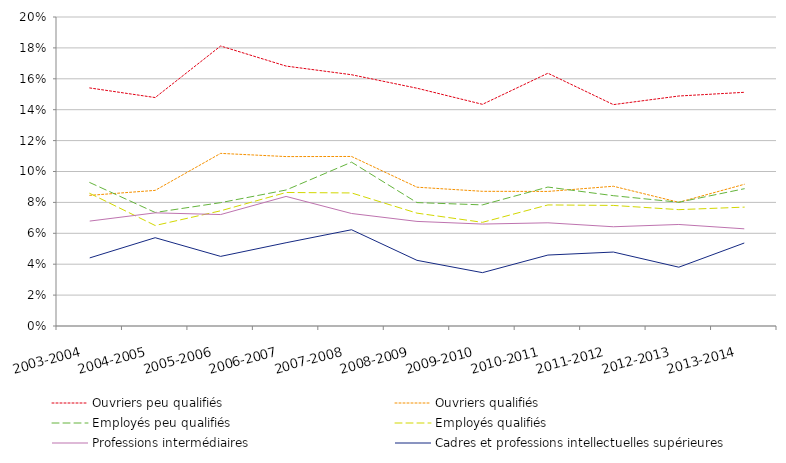
| Category | Ouvriers peu qualifiés | Ouvriers qualifiés | Employés peu qualifiés | Employés qualifiés | Professions intermédiaires | Cadres et professions intellectuelles supérieures |
|---|---|---|---|---|---|---|
| 2003-2004 | 0.154 | 0.085 | 0.093 | 0.086 | 0.068 | 0.044 |
| 2004-2005 | 0.148 | 0.088 | 0.073 | 0.065 | 0.073 | 0.057 |
| 2005-2006 | 0.181 | 0.112 | 0.08 | 0.075 | 0.072 | 0.045 |
| 2006-2007 | 0.168 | 0.11 | 0.088 | 0.086 | 0.084 | 0.054 |
| 2007-2008 | 0.163 | 0.11 | 0.106 | 0.086 | 0.073 | 0.062 |
| 2008-2009 | 0.154 | 0.09 | 0.08 | 0.073 | 0.068 | 0.043 |
| 2009-2010 | 0.143 | 0.087 | 0.078 | 0.067 | 0.066 | 0.035 |
| 2010-2011 | 0.164 | 0.087 | 0.09 | 0.078 | 0.067 | 0.046 |
| 2011-2012 | 0.143 | 0.09 | 0.084 | 0.078 | 0.064 | 0.048 |
| 2012-2013 | 0.149 | 0.08 | 0.08 | 0.075 | 0.066 | 0.038 |
| 2013-2014 | 0.151 | 0.092 | 0.089 | 0.077 | 0.063 | 0.054 |